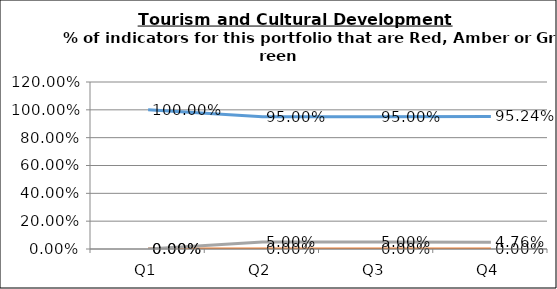
| Category | Green | Amber | Red |
|---|---|---|---|
| Q1 | 1 | 0 | 0 |
| Q2 | 0.95 | 0 | 0.05 |
| Q3 | 0.95 | 0 | 0.05 |
| Q4 | 0.952 | 0 | 0.048 |